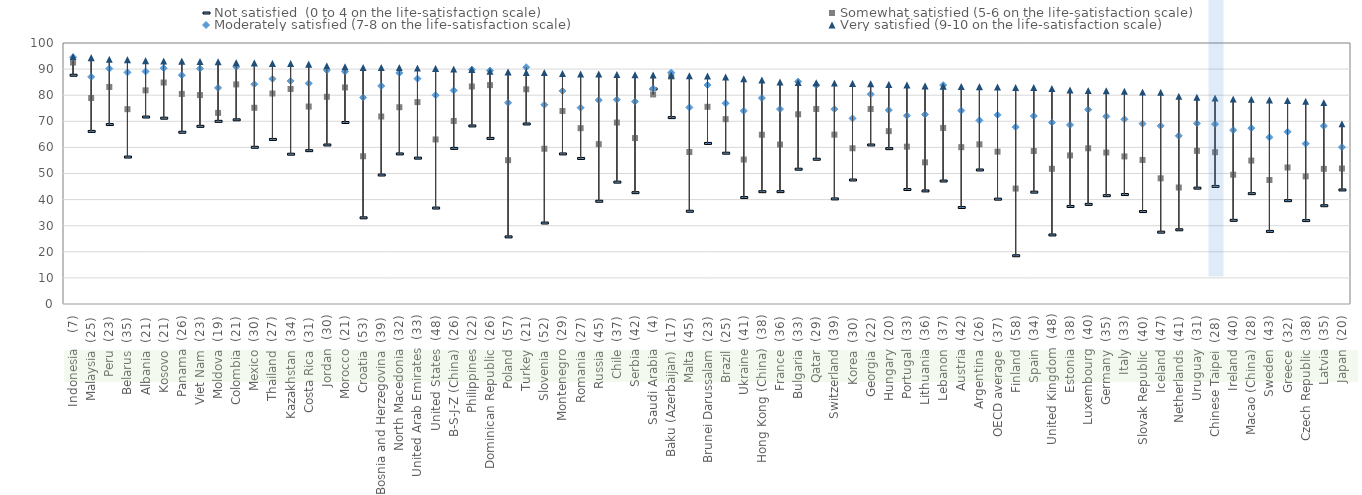
| Category | Not satisfied  (0 to 4 on the life-satisfaction scale) | Somewhat satisfied (5-6 on the life-satisfaction scale) | Moderately satisfied (7-8 on the life-satisfaction scale) | Very satisfied (9-10 on the life-satisfaction scale) |
|---|---|---|---|---|
| Indonesia    (7) | 87.648 | 92.507 | 94.55 | 94.781 |
| Malaysia  (25) | 66.128 | 78.938 | 87.025 | 94.394 |
| Peru  (23) | 68.753 | 83.161 | 90.189 | 93.74 |
| Belarus  (35) | 56.303 | 74.648 | 88.734 | 93.61 |
| Albania  (21) | 71.631 | 81.87 | 89.095 | 93.217 |
| Kosovo  (21) | 71.188 | 84.851 | 90.361 | 93.069 |
| Panama  (26) | 65.801 | 80.487 | 87.666 | 93.041 |
| Viet Nam  (23) | 68.071 | 80.057 | 90.173 | 92.912 |
| Moldova  (19) | 69.989 | 73.222 | 82.806 | 92.823 |
| Colombia  (21) | 70.566 | 84.142 | 90.876 | 92.448 |
| Mexico  (30) | 60.042 | 75.179 | 84.206 | 92.367 |
| Thailand  (27) | 63.05 | 80.657 | 86.28 | 92.191 |
| Kazakhstan  (34) | 57.396 | 82.387 | 85.454 | 92.157 |
| Costa Rica  (31) | 58.751 | 75.65 | 84.517 | 91.877 |
| Jordan  (30) | 60.927 | 79.384 | 89.563 | 91.261 |
| Morocco  (21) | 69.54 | 82.977 | 89.04 | 90.884 |
| Croatia  (53) | 33.019 | 56.605 | 79.088 | 90.612 |
| Bosnia and Herzegovina  (39) | 49.418 | 71.836 | 83.553 | 90.599 |
| North Macedonia  (32) | 57.502 | 75.395 | 88.533 | 90.565 |
| United Arab Emirates  (33) | 55.887 | 77.354 | 86.365 | 90.381 |
| United States  (48) | 36.762 | 63.045 | 80.004 | 90.261 |
| B-S-J-Z (China)  (26) | 59.618 | 70.134 | 81.835 | 90.002 |
| Philippines  (22) | 68.219 | 83.338 | 89.805 | 89.88 |
| Dominican Republic  (26) | 63.445 | 83.864 | 89.44 | 89.149 |
| Poland  (57) | 25.713 | 55.1 | 77.091 | 88.923 |
| Turkey  (21) | 68.975 | 82.275 | 90.711 | 88.671 |
| Slovenia  (52) | 31.028 | 59.482 | 76.338 | 88.651 |
| Montenegro  (29) | 57.498 | 73.934 | 81.648 | 88.292 |
| Romania  (27) | 55.767 | 67.368 | 75.232 | 88.15 |
| Russia  (45) | 39.366 | 61.241 | 78.109 | 88.151 |
| Chile  (37) | 46.692 | 69.516 | 78.275 | 87.932 |
| Serbia  (42) | 42.656 | 63.584 | 77.548 | 87.817 |
| Saudi Arabia    (4) | 82.392 | 80.292 | 82.596 | 87.738 |
| Baku (Azerbaijan)  (17) | 71.412 | 87.169 | 88.668 | 87.685 |
| Malta  (45) | 35.53 | 58.229 | 75.322 | 87.444 |
| Brunei Darussalam  (23) | 61.526 | 75.554 | 83.924 | 87.335 |
| Brazil  (25) | 57.781 | 70.811 | 76.891 | 86.942 |
| Ukraine  (41) | 40.777 | 55.344 | 73.994 | 86.281 |
| Hong Kong (China)  (38) | 43.035 | 64.849 | 78.912 | 85.798 |
| France  (36) | 43.052 | 61.094 | 74.704 | 85.044 |
| Bulgaria  (33) | 51.644 | 72.698 | 85.219 | 84.894 |
| Qatar  (29) | 55.46 | 74.724 | 83.846 | 84.781 |
| Switzerland  (39) | 40.264 | 64.89 | 74.662 | 84.626 |
| Korea  (30) | 47.506 | 59.67 | 71.1 | 84.529 |
| Georgia  (22) | 60.931 | 74.725 | 80.375 | 84.432 |
| Hungary  (20) | 59.524 | 66.235 | 74.304 | 84.14 |
| Portugal  (33) | 43.861 | 60.284 | 72.165 | 83.946 |
| Lithuania  (36) | 43.322 | 54.277 | 72.613 | 83.565 |
| Lebanon  (37) | 47.115 | 67.464 | 83.857 | 83.466 |
| Austria  (42) | 36.976 | 60.096 | 74.109 | 83.327 |
| Argentina  (26) | 51.351 | 61.187 | 70.346 | 83.275 |
| OECD average  (37) | 40.174 | 58.368 | 72.475 | 83.142 |
| Finland  (58) | 18.485 | 44.236 | 67.814 | 82.954 |
| Spain  (34) | 42.856 | 58.605 | 72.038 | 82.93 |
| United Kingdom  (48) | 26.45 | 51.805 | 69.541 | 82.546 |
| Estonia  (38) | 37.384 | 56.924 | 68.612 | 81.988 |
| Luxembourg  (40) | 38.168 | 59.661 | 74.479 | 81.77 |
| Germany  (35) | 41.506 | 58.038 | 71.883 | 81.706 |
| Italy  (33) | 41.934 | 56.547 | 70.761 | 81.515 |
| Slovak Republic  (40) | 35.417 | 55.188 | 69.078 | 81.197 |
| Iceland  (47) | 27.524 | 48.156 | 68.248 | 81.102 |
| Netherlands  (41) | 28.436 | 44.631 | 64.438 | 79.579 |
| Uruguay  (31) | 44.393 | 58.679 | 69.213 | 79.203 |
| Chinese Taipei  (28) | 45.041 | 58.167 | 68.926 | 78.881 |
| Ireland  (40) | 32.055 | 49.543 | 66.615 | 78.506 |
| Macao (China)  (28) | 42.281 | 54.944 | 67.397 | 78.408 |
| Sweden  (43) | 27.819 | 47.505 | 63.864 | 78.198 |
| Greece  (32) | 39.595 | 52.307 | 65.987 | 77.967 |
| Czech Republic  (38) | 31.954 | 48.898 | 61.425 | 77.673 |
| Latvia  (35) | 37.654 | 51.788 | 68.221 | 77.178 |
| Japan  (20) | 43.695 | 51.911 | 60.101 | 69.025 |